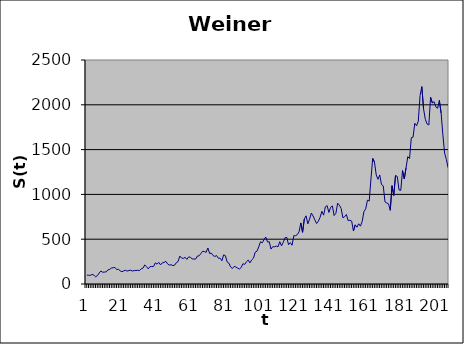
| Category | Series 0 |
|---|---|
| 0 | 100 |
| 1 | 96.957 |
| 2 | 96.938 |
| 3 | 107.501 |
| 4 | 98.852 |
| 5 | 80.14 |
| 6 | 93.912 |
| 7 | 122.736 |
| 8 | 144.868 |
| 9 | 131.048 |
| 10 | 133.148 |
| 11 | 135.043 |
| 12 | 157.692 |
| 13 | 162.759 |
| 14 | 178.097 |
| 15 | 181.567 |
| 16 | 185.209 |
| 17 | 161.235 |
| 18 | 163.795 |
| 19 | 147.378 |
| 20 | 136.379 |
| 21 | 146.682 |
| 22 | 153.069 |
| 23 | 144.514 |
| 24 | 149.97 |
| 25 | 154.387 |
| 26 | 144.091 |
| 27 | 151.002 |
| 28 | 149.628 |
| 29 | 153.439 |
| 30 | 149.449 |
| 31 | 169.579 |
| 32 | 176.501 |
| 33 | 212.744 |
| 34 | 193.577 |
| 35 | 168.724 |
| 36 | 194.184 |
| 37 | 195.491 |
| 38 | 194.961 |
| 39 | 235.457 |
| 40 | 221.408 |
| 41 | 241.56 |
| 42 | 213.247 |
| 43 | 235.986 |
| 44 | 240.361 |
| 45 | 253.265 |
| 46 | 224.545 |
| 47 | 210.354 |
| 48 | 215.75 |
| 49 | 206.005 |
| 50 | 208.938 |
| 51 | 237.963 |
| 52 | 250.463 |
| 53 | 311.604 |
| 54 | 290.115 |
| 55 | 285.888 |
| 56 | 298.068 |
| 57 | 274.986 |
| 58 | 301.985 |
| 59 | 298.567 |
| 60 | 280.941 |
| 61 | 278.551 |
| 62 | 278.114 |
| 63 | 311.167 |
| 64 | 314.514 |
| 65 | 339.582 |
| 66 | 365.895 |
| 67 | 361.731 |
| 68 | 353.465 |
| 69 | 401.973 |
| 70 | 340.317 |
| 71 | 344.252 |
| 72 | 317.018 |
| 73 | 307.814 |
| 74 | 317.132 |
| 75 | 287.787 |
| 76 | 287.981 |
| 77 | 259.165 |
| 78 | 325.267 |
| 79 | 315.461 |
| 80 | 246.31 |
| 81 | 232.791 |
| 82 | 189.15 |
| 83 | 173.794 |
| 84 | 196.146 |
| 85 | 189.665 |
| 86 | 176.867 |
| 87 | 166.747 |
| 88 | 184.328 |
| 89 | 226.133 |
| 90 | 218.72 |
| 91 | 247.994 |
| 92 | 266.862 |
| 93 | 235.808 |
| 94 | 269.268 |
| 95 | 287.953 |
| 96 | 355.88 |
| 97 | 365.957 |
| 98 | 414.154 |
| 99 | 471.043 |
| 100 | 459.986 |
| 101 | 494.283 |
| 102 | 524.545 |
| 103 | 469.614 |
| 104 | 470.856 |
| 105 | 389.712 |
| 106 | 416.675 |
| 107 | 415.37 |
| 108 | 423.172 |
| 109 | 414.626 |
| 110 | 472.317 |
| 111 | 425.637 |
| 112 | 465.981 |
| 113 | 516.31 |
| 114 | 519.698 |
| 115 | 438.537 |
| 116 | 462.129 |
| 117 | 432.5 |
| 118 | 539.545 |
| 119 | 538.661 |
| 120 | 550.016 |
| 121 | 582.873 |
| 122 | 681.608 |
| 123 | 577.051 |
| 124 | 725.339 |
| 125 | 760.84 |
| 126 | 671.44 |
| 127 | 725.17 |
| 128 | 791.758 |
| 129 | 759.526 |
| 130 | 714.864 |
| 131 | 674.726 |
| 132 | 700.968 |
| 133 | 744.119 |
| 134 | 811.019 |
| 135 | 768.455 |
| 136 | 861.621 |
| 137 | 874.554 |
| 138 | 798.794 |
| 139 | 855.491 |
| 140 | 871.205 |
| 141 | 763.93 |
| 142 | 789.158 |
| 143 | 901.658 |
| 144 | 879.072 |
| 145 | 842.687 |
| 146 | 738.87 |
| 147 | 750.965 |
| 148 | 775.719 |
| 149 | 706.148 |
| 150 | 711.822 |
| 151 | 701.657 |
| 152 | 591.912 |
| 153 | 659.993 |
| 154 | 633.883 |
| 155 | 672.201 |
| 156 | 645.47 |
| 157 | 698.853 |
| 158 | 808.221 |
| 159 | 838.416 |
| 160 | 935.313 |
| 161 | 925.892 |
| 162 | 1173.095 |
| 163 | 1401.935 |
| 164 | 1359.91 |
| 165 | 1217.567 |
| 166 | 1168.292 |
| 167 | 1217.075 |
| 168 | 1110.245 |
| 169 | 1095.707 |
| 170 | 916.743 |
| 171 | 904.342 |
| 172 | 894.465 |
| 173 | 822.604 |
| 174 | 1096.594 |
| 175 | 988.591 |
| 176 | 1209.979 |
| 177 | 1200.904 |
| 178 | 1050.609 |
| 179 | 1045.192 |
| 180 | 1265.688 |
| 181 | 1172.636 |
| 182 | 1295.599 |
| 183 | 1421.542 |
| 184 | 1399.316 |
| 185 | 1632.338 |
| 186 | 1639.249 |
| 187 | 1793.906 |
| 188 | 1766.137 |
| 189 | 1817.304 |
| 190 | 2103.617 |
| 191 | 2202.342 |
| 192 | 1953.226 |
| 193 | 1838.966 |
| 194 | 1786.043 |
| 195 | 1774.49 |
| 196 | 2083.988 |
| 197 | 2020.693 |
| 198 | 2034.546 |
| 199 | 1976.647 |
| 200 | 1960.703 |
| 201 | 2048.416 |
| 202 | 1908.78 |
| 203 | 1666.089 |
| 204 | 1461.454 |
| 205 | 1389.484 |
| 206 | 1297.72 |